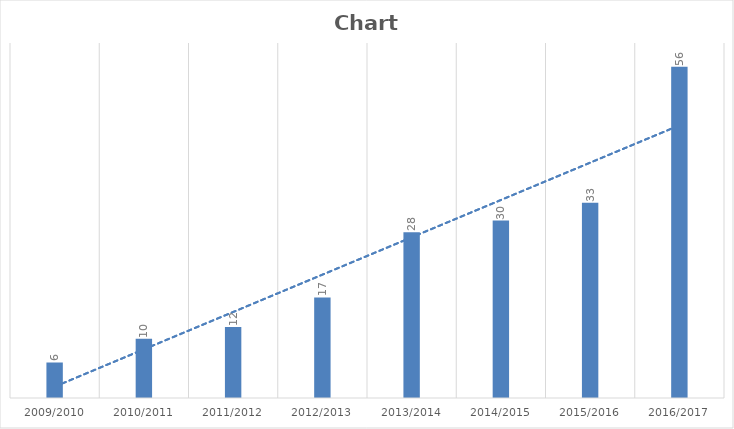
| Category | Series 0 |
|---|---|
| 2009/2010 | 6 |
| 2010/2011 | 10 |
| 2011/2012 | 12 |
| 2012/2013 | 17 |
| 2013/2014 | 28 |
| 2014/2015 | 30 |
| 2015/2016 | 33 |
| 2016/2017 | 56 |